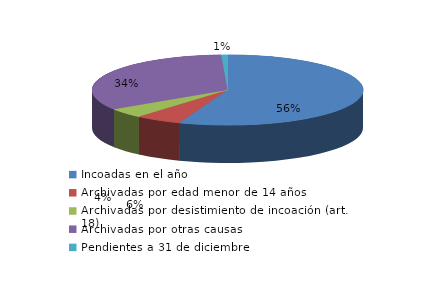
| Category | Series 0 |
|---|---|
| Incoadas en el año | 990 |
| Archivadas por edad menor de 14 años | 98 |
| Archivadas por desistimiento de incoación (art. 18) | 79 |
| Archivadas por otras causas | 595 |
| Pendientes a 31 de diciembre | 13 |